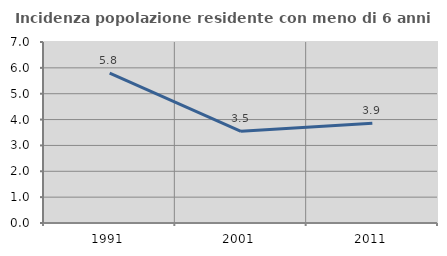
| Category | Incidenza popolazione residente con meno di 6 anni |
|---|---|
| 1991.0 | 5.796 |
| 2001.0 | 3.544 |
| 2011.0 | 3.859 |